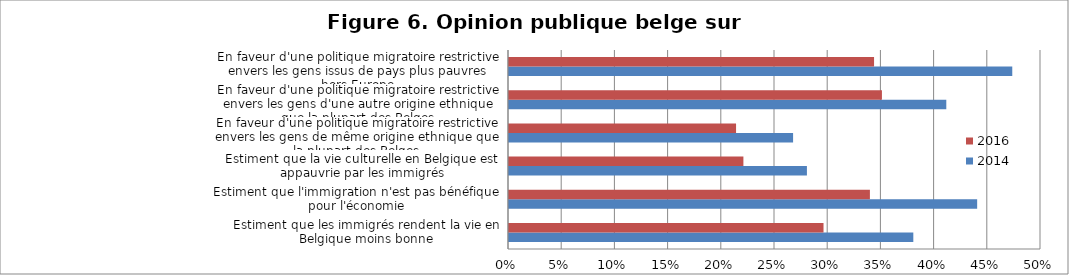
| Category | 2014 | 2016 |
|---|---|---|
| Estiment que les immigrés rendent la vie en Belgique moins bonne | 0.38 | 0.296 |
| Estiment que l'immigration n'est pas bénéfique pour l'économie | 0.44 | 0.339 |
| Estiment que la vie culturelle en Belgique est appauvrie par les immigrés | 0.28 | 0.22 |
| En faveur d'une politique migratoire restrictive envers les gens de même origine ethnique que la plupart des Belges | 0.267 | 0.213 |
| En faveur d'une politique migratoire restrictive envers les gens d'une autre origine ethnique que la plupart des Belges | 0.411 | 0.35 |
| En faveur d'une politique migratoire restrictive envers les gens issus de pays plus pauvres hors Europe | 0.473 | 0.343 |